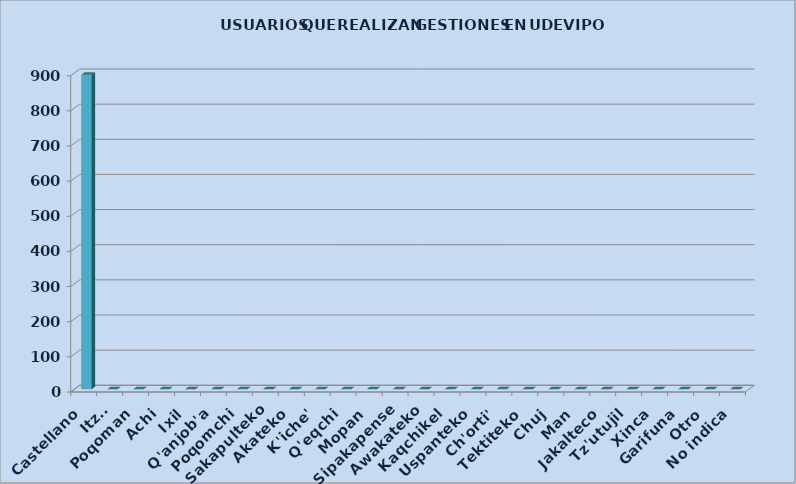
| Category | Series 0 |
|---|---|
| Castellano | 895 |
| Itza' | 0 |
| Poqoman | 0 |
| Achi | 0 |
| Ixil | 0 |
| Q'anjob'a | 0 |
| Poqomchi | 0 |
| Sakapulteko | 0 |
| Akateko | 0 |
| K'iche' | 0 |
| Q'eqchi | 0 |
| Mopan | 0 |
| Sipakapense | 0 |
| Awakateko | 0 |
| Kaqchikel | 0 |
| Uspanteko | 0 |
| Ch'orti' | 0 |
| Tektiteko | 0 |
| Chuj | 0 |
| Man | 0 |
| Jakalteco | 0 |
| Tz'utujil | 0 |
| Xinca | 0 |
| Garifuna | 0 |
| Otro | 0 |
| No indica | 0 |